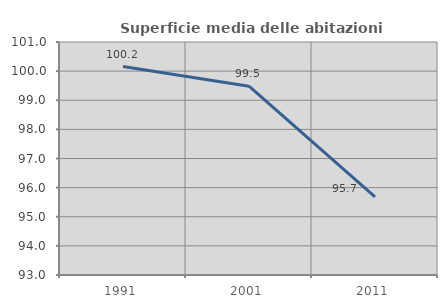
| Category | Superficie media delle abitazioni occupate |
|---|---|
| 1991.0 | 100.156 |
| 2001.0 | 99.481 |
| 2011.0 | 95.682 |